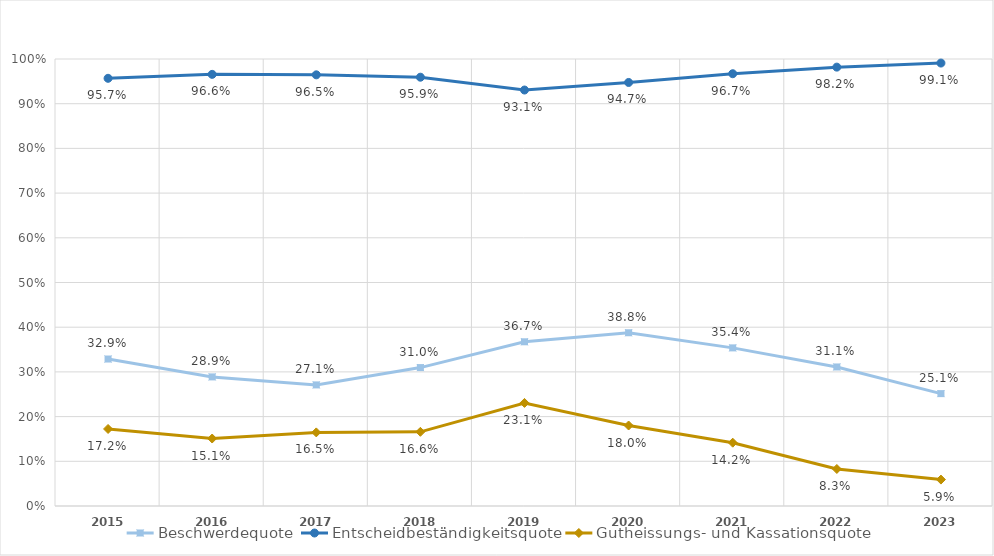
| Category | Beschwerdequote | Entscheidbeständigkeitsquote | Gutheissungs- und Kassationsquote |
|---|---|---|---|
| 2015.0 | 0.329 | 0.957 | 0.172 |
| 2016.0 | 0.289 | 0.966 | 0.151 |
| 2017.0 | 0.271 | 0.965 | 0.165 |
| 2018.0 | 0.31 | 0.959 | 0.166 |
| 2019.0 | 0.367 | 0.931 | 0.231 |
| 2020.0 | 0.388 | 0.947 | 0.18 |
| 2021.0 | 0.354 | 0.967 | 0.142 |
| 2022.0 | 0.311 | 0.982 | 0.083 |
| 2023.0 | 0.251 | 0.991 | 0.059 |